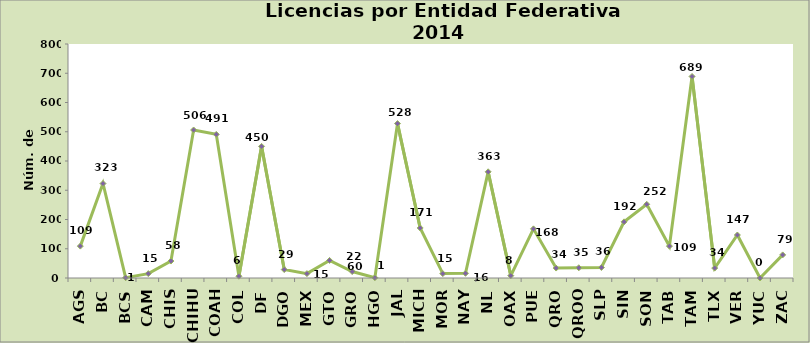
| Category | Series 0 |
|---|---|
| AGS | 109 |
| BC | 323 |
| BCS | 1 |
| CAM | 15 |
| CHIS | 58 |
| CHIHU | 506 |
| COAH | 491 |
| COL | 6 |
| DF | 450 |
| DGO | 29 |
| MEX | 15 |
| GTO | 60 |
| GRO | 22 |
| HGO | 1 |
| JAL | 528 |
| MICH | 171 |
| MOR | 15 |
| NAY | 16 |
| NL | 363 |
| OAX | 8 |
| PUE | 168 |
| QRO | 34 |
| QROO | 35 |
| SLP | 36 |
| SIN | 192 |
| SON | 252 |
| TAB | 109 |
| TAM | 689 |
| TLX | 34 |
| VER | 147 |
| YUC | 0 |
| ZAC | 79 |